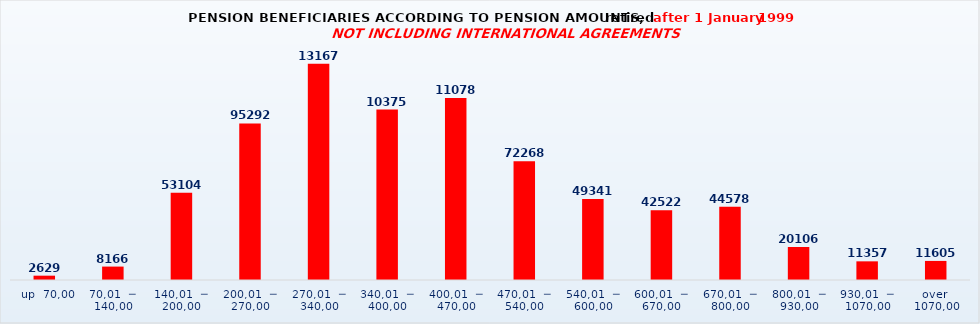
| Category | Series 0 |
|---|---|
|   up  70,00 | 2629 |
| 70,01  ─  140,00 | 8166 |
| 140,01  ─  200,00 | 53104 |
| 200,01  ─  270,00 | 95292 |
| 270,01  ─  340,00 | 131676 |
| 340,01  ─  400,00 | 103750 |
| 400,01  ─  470,00 | 110782 |
| 470,01  ─  540,00 | 72268 |
| 540,01  ─  600,00 | 49341 |
| 600,01  ─  670,00 | 42522 |
| 670,01  ─  800,00 | 44578 |
| 800,01  ─  930,00 | 20106 |
| 930,01  ─  1070,00 | 11357 |
| over  1070,00 | 11605 |